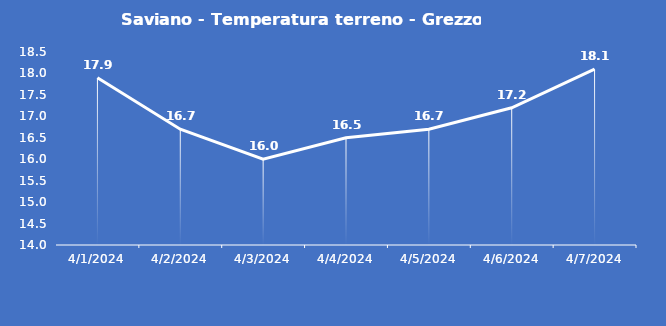
| Category | Saviano - Temperatura terreno - Grezzo (°C) |
|---|---|
| 4/1/24 | 17.9 |
| 4/2/24 | 16.7 |
| 4/3/24 | 16 |
| 4/4/24 | 16.5 |
| 4/5/24 | 16.7 |
| 4/6/24 | 17.2 |
| 4/7/24 | 18.1 |